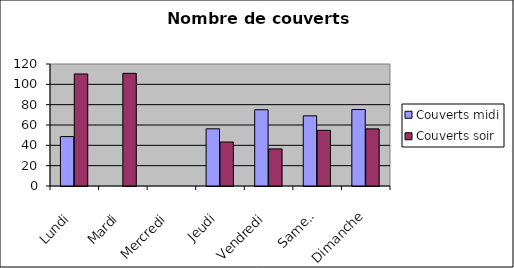
| Category | Couverts |
|---|---|
| Lundi | 110.2 |
| Mardi | 110.8 |
| Mercredi | 0 |
| Jeudi | 43.25 |
| Vendredi | 36.5 |
| Samedi | 54.75 |
| Dimanche | 56.2 |